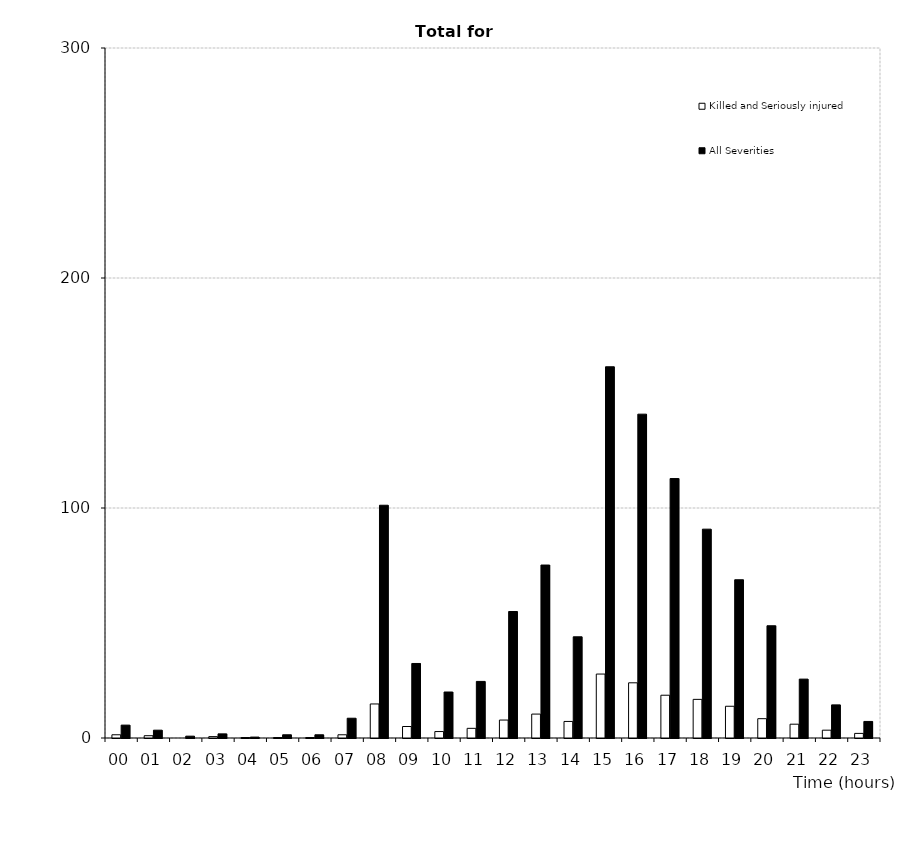
| Category | Killed and Seriously injured | All Severities |
|---|---|---|
| 00 | 1.4 | 5.6 |
| 01 | 1 | 3.4 |
| 02 | 0 | 0.8 |
| 03 | 0.6 | 1.8 |
| 04 | 0.2 | 0.4 |
| 05 | 0.2 | 1.4 |
| 06 | 0.2 | 1.4 |
| 07 | 1.4 | 8.6 |
| 08 | 14.8 | 101.2 |
| 09 | 5 | 32.4 |
| 10 | 2.8 | 20 |
| 11 | 4.2 | 24.6 |
| 12 | 7.8 | 55 |
| 13 | 10.4 | 75.2 |
| 14 | 7.2 | 44 |
| 15 | 27.8 | 161.4 |
| 16 | 24 | 140.8 |
| 17 | 18.6 | 112.8 |
| 18 | 16.8 | 90.8 |
| 19 | 13.8 | 68.8 |
| 20 | 8.4 | 48.8 |
| 21 | 6 | 25.6 |
| 22 | 3.4 | 14.4 |
| 23 | 2 | 7.2 |